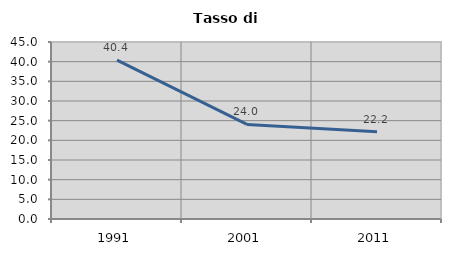
| Category | Tasso di disoccupazione   |
|---|---|
| 1991.0 | 40.403 |
| 2001.0 | 24.047 |
| 2011.0 | 22.213 |